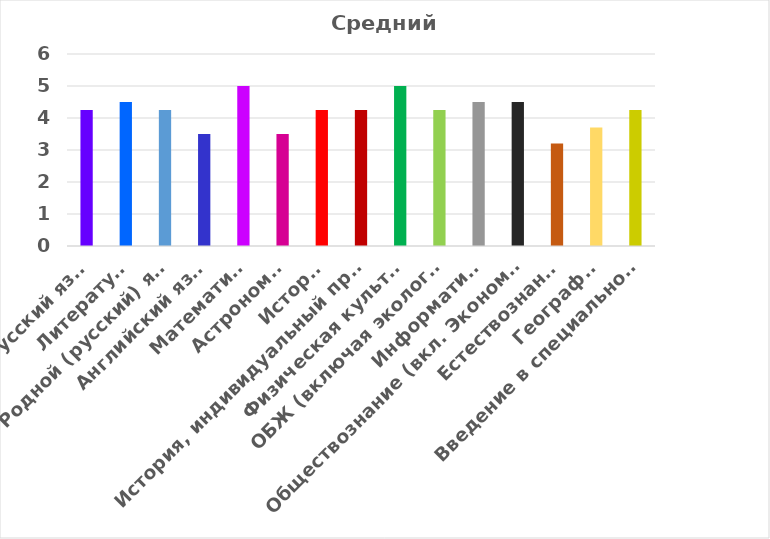
| Category | Средний балл |
|---|---|
| Русский язык | 4.25 |
| Литература | 4.5 |
| Родной (русский) язык | 4.25 |
| Английский язык | 3.5 |
| Математика | 5 |
| Астрономия | 3.5 |
| История | 4.25 |
| История, индивидуальный проект | 4.25 |
| Физическая культура | 5 |
| ОБЖ (включая экологию) | 4.25 |
| Информатика | 4.5 |
| Обществознание (вкл. Экономику и право)  | 4.5 |
| Естествознание | 3.2 |
| География | 3.7 |
| Введение в специальность | 4.25 |